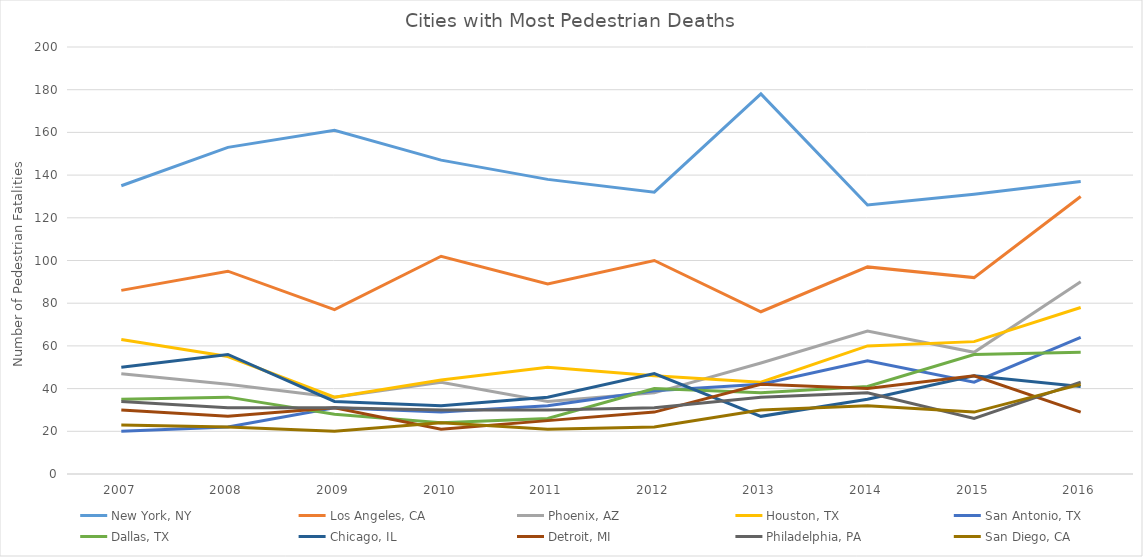
| Category | New York, NY | Los Angeles, CA | Phoenix, AZ | Houston, TX | San Antonio, TX | Dallas, TX | Chicago, IL | Detroit, MI | Philadelphia, PA | San Diego, CA |
|---|---|---|---|---|---|---|---|---|---|---|
| 2007 | 135 | 86 | 47 | 63 | 20 | 35 | 50 | 30 | 34 | 23 |
| 2008 | 153 | 95 | 42 | 55 | 22 | 36 | 56 | 27 | 31 | 22 |
| 2009 | 161 | 77 | 36 | 36 | 31 | 28 | 34 | 31 | 31 | 20 |
| 2010 | 147 | 102 | 43 | 44 | 29 | 24 | 32 | 21 | 30 | 24 |
| 2011 | 138 | 89 | 34 | 50 | 32 | 26 | 36 | 25 | 30 | 21 |
| 2012 | 132 | 100 | 38 | 46 | 39 | 40 | 47 | 29 | 31 | 22 |
| 2013 | 178 | 76 | 52 | 43 | 42 | 38 | 27 | 42 | 36 | 30 |
| 2014 | 126 | 97 | 67 | 60 | 53 | 41 | 35 | 40 | 38 | 32 |
| 2015 | 131 | 92 | 57 | 62 | 43 | 56 | 46 | 46 | 26 | 29 |
| 2016 | 137 | 130 | 90 | 78 | 64 | 57 | 41 | 29 | 43 | 42 |